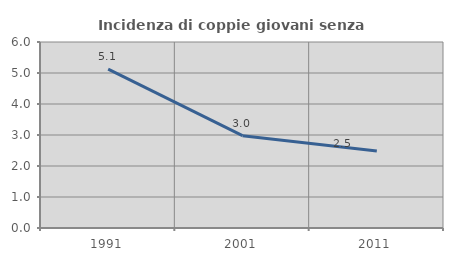
| Category | Incidenza di coppie giovani senza figli |
|---|---|
| 1991.0 | 5.122 |
| 2001.0 | 2.979 |
| 2011.0 | 2.484 |